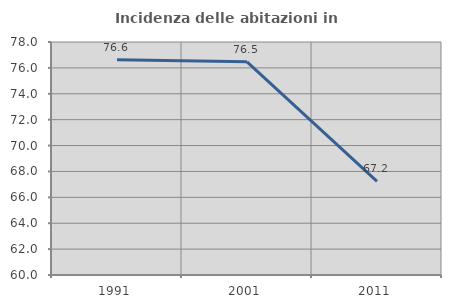
| Category | Incidenza delle abitazioni in proprietà  |
|---|---|
| 1991.0 | 76.636 |
| 2001.0 | 76.471 |
| 2011.0 | 67.234 |